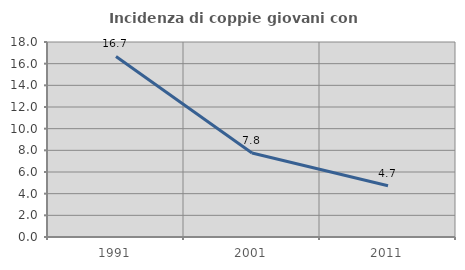
| Category | Incidenza di coppie giovani con figli |
|---|---|
| 1991.0 | 16.667 |
| 2001.0 | 7.759 |
| 2011.0 | 4.734 |